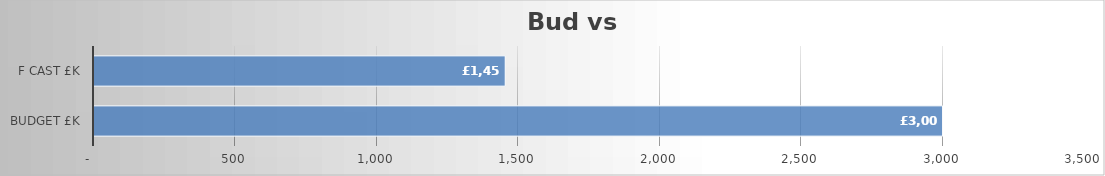
| Category | Series 0 |
|---|---|
| Budget £k | 3000 |
| F cast £k | 1453.807 |